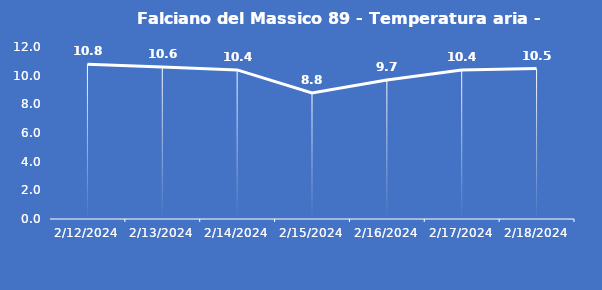
| Category | Falciano del Massico 89 - Temperatura aria - Grezzo (°C) |
|---|---|
| 2/12/24 | 10.8 |
| 2/13/24 | 10.6 |
| 2/14/24 | 10.4 |
| 2/15/24 | 8.8 |
| 2/16/24 | 9.7 |
| 2/17/24 | 10.4 |
| 2/18/24 | 10.5 |